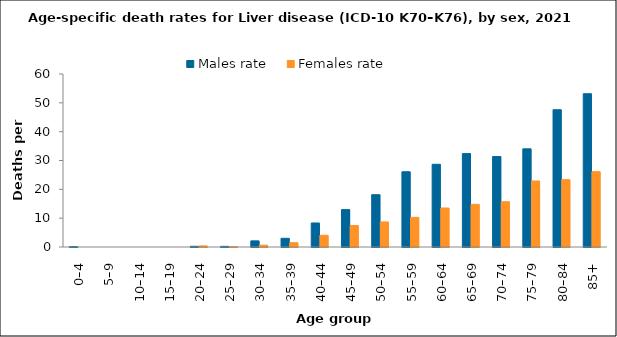
| Category | Males rate | Females rate |
|---|---|---|
| 0–4 | 0.129 | 0 |
| 5–9 | 0 | 0 |
| 10–14 | 0 | 0 |
| 15–19 | 0 | 0 |
| 20–24 | 0.239 | 0.382 |
| 25–29 | 0.218 | 0.111 |
| 30–34 | 2.126 | 0.626 |
| 35–39 | 3.016 | 1.491 |
| 40–44 | 8.334 | 4.054 |
| 45–49 | 12.97 | 7.445 |
| 50–54 | 18.132 | 8.686 |
| 55–59 | 26.097 | 10.28 |
| 60–64 | 28.684 | 13.531 |
| 65–69 | 32.387 | 14.79 |
| 70–74 | 31.369 | 15.707 |
| 75–79 | 34.034 | 22.892 |
| 80–84 | 47.607 | 23.355 |
| 85+ | 53.157 | 26.118 |